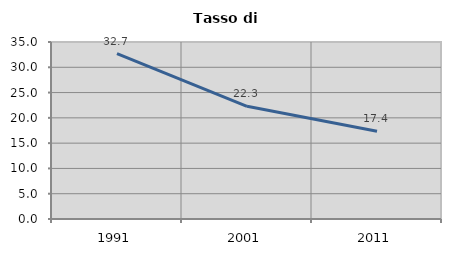
| Category | Tasso di disoccupazione   |
|---|---|
| 1991.0 | 32.717 |
| 2001.0 | 22.28 |
| 2011.0 | 17.37 |